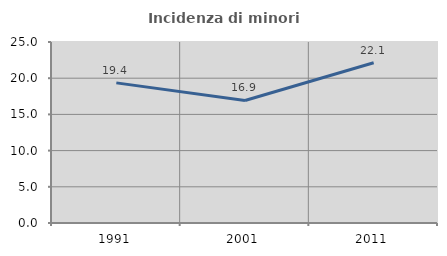
| Category | Incidenza di minori stranieri |
|---|---|
| 1991.0 | 19.355 |
| 2001.0 | 16.923 |
| 2011.0 | 22.137 |